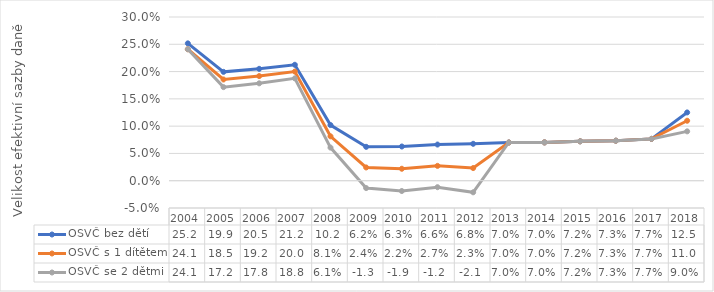
| Category | OSVČ bez dětí | OSVČ s 1 dítětem | OSVČ se 2 dětmi |
|---|---|---|---|
| 2004.0 | 0.252 | 0.241 | 0.241 |
| 2005.0 | 0.199 | 0.185 | 0.172 |
| 2006.0 | 0.205 | 0.192 | 0.178 |
| 2007.0 | 0.212 | 0.2 | 0.188 |
| 2008.0 | 0.102 | 0.081 | 0.061 |
| 2009.0 | 0.062 | 0.024 | -0.013 |
| 2010.0 | 0.063 | 0.022 | -0.019 |
| 2011.0 | 0.066 | 0.027 | -0.012 |
| 2012.0 | 0.068 | 0.023 | -0.021 |
| 2013.0 | 0.07 | 0.07 | 0.07 |
| 2014.0 | 0.07 | 0.07 | 0.07 |
| 2015.0 | 0.072 | 0.072 | 0.072 |
| 2016.0 | 0.073 | 0.073 | 0.073 |
| 2017.0 | 0.077 | 0.077 | 0.077 |
| 2018.0 | 0.125 | 0.11 | 0.09 |